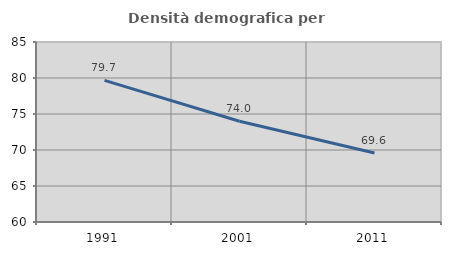
| Category | Densità demografica |
|---|---|
| 1991.0 | 79.674 |
| 2001.0 | 73.986 |
| 2011.0 | 69.573 |